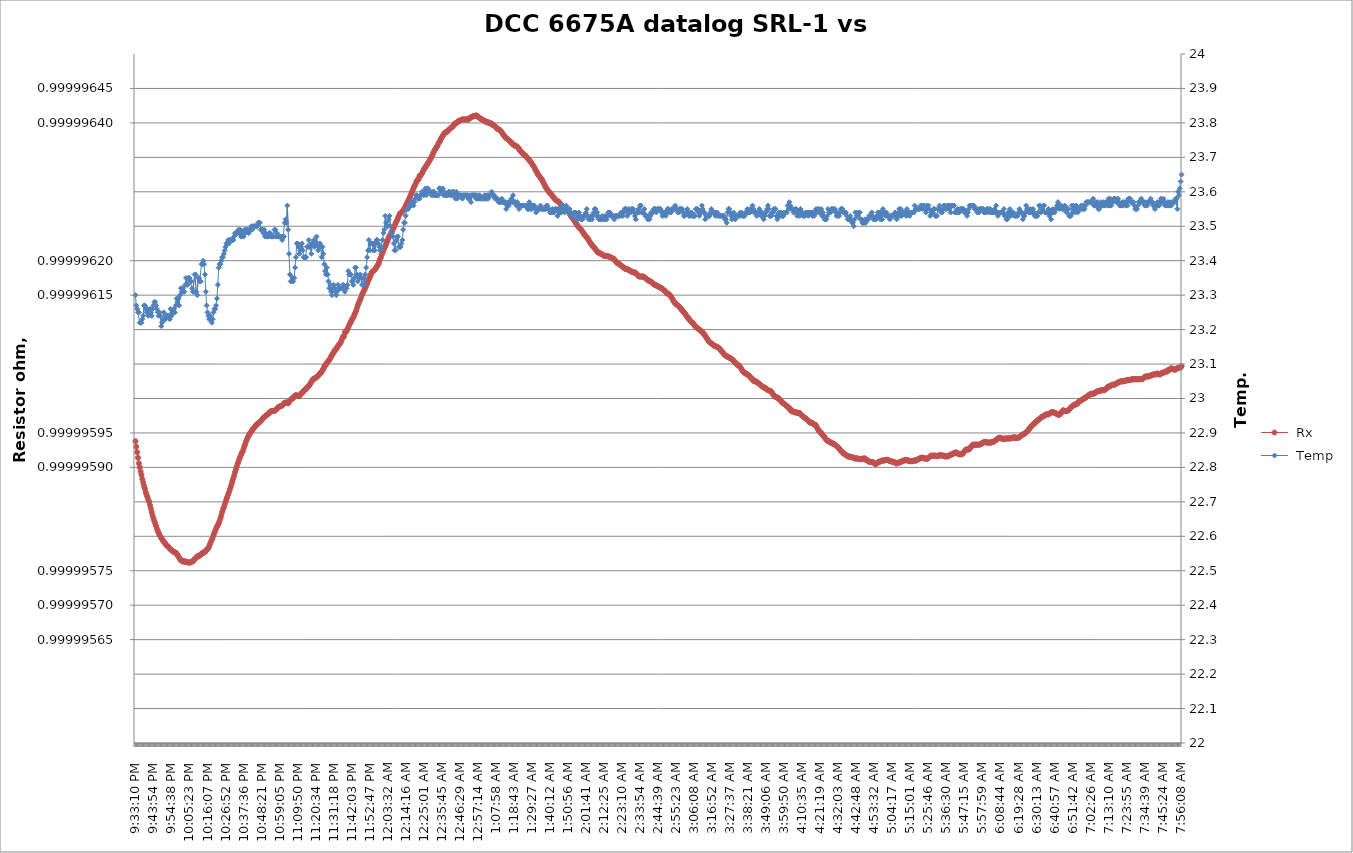
| Category |  Rx |
|---|---|
| 2021-03-11 21:33:10 | 1 |
| 2021-03-11 21:33:40 | 1 |
| 2021-03-11 21:34:11 | 1 |
| 2021-03-11 21:34:42 | 1 |
| 2021-03-11 21:35:12 | 1 |
| 2021-03-11 21:35:43 | 1 |
| 2021-03-11 21:36:14 | 1 |
| 2021-03-11 21:36:44 | 1 |
| 2021-03-11 21:37:15 | 1 |
| 2021-03-11 21:37:46 | 1 |
| 2021-03-11 21:38:16 | 1 |
| 2021-03-11 21:38:47 | 1 |
| 2021-03-11 21:39:18 | 1 |
| 2021-03-11 21:39:49 | 1 |
| 2021-03-11 21:40:19 | 1 |
| 2021-03-11 21:40:50 | 1 |
| 2021-03-11 21:41:21 | 1 |
| 2021-03-11 21:41:51 | 1 |
| 2021-03-11 21:42:22 | 1 |
| 2021-03-11 21:42:53 | 1 |
| 2021-03-11 21:43:23 | 1 |
| 2021-03-11 21:43:54 | 1 |
| 2021-03-11 21:44:25 | 1 |
| 2021-03-11 21:44:55 | 1 |
| 2021-03-11 21:45:26 | 1 |
| 2021-03-11 21:45:57 | 1 |
| 2021-03-11 21:46:27 | 1 |
| 2021-03-11 21:46:58 | 1 |
| 2021-03-11 21:47:29 | 1 |
| 2021-03-11 21:48:00 | 1 |
| 2021-03-11 21:48:30 | 1 |
| 2021-03-11 21:49:01 | 1 |
| 2021-03-11 21:49:32 | 1 |
| 2021-03-11 21:50:02 | 1 |
| 2021-03-11 21:50:33 | 1 |
| 2021-03-11 21:51:04 | 1 |
| 2021-03-11 21:51:34 | 1 |
| 2021-03-11 21:52:05 | 1 |
| 2021-03-11 21:52:36 | 1 |
| 2021-03-11 21:53:06 | 1 |
| 2021-03-11 21:53:37 | 1 |
| 2021-03-11 21:54:08 | 1 |
| 2021-03-11 21:54:38 | 1 |
| 2021-03-11 21:55:09 | 1 |
| 2021-03-11 21:55:40 | 1 |
| 2021-03-11 21:56:11 | 1 |
| 2021-03-11 21:56:41 | 1 |
| 2021-03-11 21:57:12 | 1 |
| 2021-03-11 21:57:43 | 1 |
| 2021-03-11 21:58:13 | 1 |
| 2021-03-11 21:58:44 | 1 |
| 2021-03-11 21:59:15 | 1 |
| 2021-03-11 21:59:45 | 1 |
| 2021-03-11 22:00:16 | 1 |
| 2021-03-11 22:00:47 | 1 |
| 2021-03-11 22:01:17 | 1 |
| 2021-03-11 22:01:48 | 1 |
| 2021-03-11 22:02:19 | 1 |
| 2021-03-11 22:02:49 | 1 |
| 2021-03-11 22:03:20 | 1 |
| 2021-03-11 22:03:51 | 1 |
| 2021-03-11 22:04:22 | 1 |
| 2021-03-11 22:04:52 | 1 |
| 2021-03-11 22:05:23 | 1 |
| 2021-03-11 22:05:54 | 1 |
| 2021-03-11 22:06:24 | 1 |
| 2021-03-11 22:06:55 | 1 |
| 2021-03-11 22:07:26 | 1 |
| 2021-03-11 22:07:56 | 1 |
| 2021-03-11 22:08:27 | 1 |
| 2021-03-11 22:08:58 | 1 |
| 2021-03-11 22:09:28 | 1 |
| 2021-03-11 22:09:59 | 1 |
| 2021-03-11 22:10:30 | 1 |
| 2021-03-11 22:11:00 | 1 |
| 2021-03-11 22:11:31 | 1 |
| 2021-03-11 22:12:02 | 1 |
| 2021-03-11 22:12:33 | 1 |
| 2021-03-11 22:13:03 | 1 |
| 2021-03-11 22:13:34 | 1 |
| 2021-03-11 22:14:05 | 1 |
| 2021-03-11 22:14:35 | 1 |
| 2021-03-11 22:15:06 | 1 |
| 2021-03-11 22:15:37 | 1 |
| 2021-03-11 22:16:07 | 1 |
| 2021-03-11 22:16:38 | 1 |
| 2021-03-11 22:17:09 | 1 |
| 2021-03-11 22:17:39 | 1 |
| 2021-03-11 22:18:10 | 1 |
| 2021-03-11 22:18:41 | 1 |
| 2021-03-11 22:19:11 | 1 |
| 2021-03-11 22:19:42 | 1 |
| 2021-03-11 22:20:13 | 1 |
| 2021-03-11 22:20:43 | 1 |
| 2021-03-11 22:21:14 | 1 |
| 2021-03-11 22:21:45 | 1 |
| 2021-03-11 22:22:16 | 1 |
| 2021-03-11 22:22:46 | 1 |
| 2021-03-11 22:23:17 | 1 |
| 2021-03-11 22:23:48 | 1 |
| 2021-03-11 22:24:18 | 1 |
| 2021-03-11 22:24:49 | 1 |
| 2021-03-11 22:25:20 | 1 |
| 2021-03-11 22:25:50 | 1 |
| 2021-03-11 22:26:21 | 1 |
| 2021-03-11 22:26:52 | 1 |
| 2021-03-11 22:27:22 | 1 |
| 2021-03-11 22:27:53 | 1 |
| 2021-03-11 22:28:24 | 1 |
| 2021-03-11 22:28:55 | 1 |
| 2021-03-11 22:29:25 | 1 |
| 2021-03-11 22:29:56 | 1 |
| 2021-03-11 22:30:27 | 1 |
| 2021-03-11 22:30:57 | 1 |
| 2021-03-11 22:31:28 | 1 |
| 2021-03-11 22:31:59 | 1 |
| 2021-03-11 22:32:29 | 1 |
| 2021-03-11 22:33:00 | 1 |
| 2021-03-11 22:33:31 | 1 |
| 2021-03-11 22:34:01 | 1 |
| 2021-03-11 22:34:32 | 1 |
| 2021-03-11 22:35:03 | 1 |
| 2021-03-11 22:35:33 | 1 |
| 2021-03-11 22:36:04 | 1 |
| 2021-03-11 22:36:35 | 1 |
| 2021-03-11 22:37:06 | 1 |
| 2021-03-11 22:37:36 | 1 |
| 2021-03-11 22:38:07 | 1 |
| 2021-03-11 22:38:38 | 1 |
| 2021-03-11 22:39:08 | 1 |
| 2021-03-11 22:39:39 | 1 |
| 2021-03-11 22:40:10 | 1 |
| 2021-03-11 22:40:40 | 1 |
| 2021-03-11 22:41:11 | 1 |
| 2021-03-11 22:41:42 | 1 |
| 2021-03-11 22:42:12 | 1 |
| 2021-03-11 22:42:43 | 1 |
| 2021-03-11 22:43:14 | 1 |
| 2021-03-11 22:43:45 | 1 |
| 2021-03-11 22:44:15 | 1 |
| 2021-03-11 22:44:46 | 1 |
| 2021-03-11 22:45:17 | 1 |
| 2021-03-11 22:45:47 | 1 |
| 2021-03-11 22:46:18 | 1 |
| 2021-03-11 22:46:49 | 1 |
| 2021-03-11 22:47:19 | 1 |
| 2021-03-11 22:47:50 | 1 |
| 2021-03-11 22:48:21 | 1 |
| 2021-03-11 22:48:51 | 1 |
| 2021-03-11 22:49:22 | 1 |
| 2021-03-11 22:49:53 | 1 |
| 2021-03-11 22:50:23 | 1 |
| 2021-03-11 22:50:54 | 1 |
| 2021-03-11 22:51:25 | 1 |
| 2021-03-11 22:51:56 | 1 |
| 2021-03-11 22:52:26 | 1 |
| 2021-03-11 22:52:57 | 1 |
| 2021-03-11 22:53:28 | 1 |
| 2021-03-11 22:53:58 | 1 |
| 2021-03-11 22:54:29 | 1 |
| 2021-03-11 22:55:00 | 1 |
| 2021-03-11 22:55:30 | 1 |
| 2021-03-11 22:56:01 | 1 |
| 2021-03-11 22:56:32 | 1 |
| 2021-03-11 22:57:02 | 1 |
| 2021-03-11 22:57:33 | 1 |
| 2021-03-11 22:58:04 | 1 |
| 2021-03-11 22:58:34 | 1 |
| 2021-03-11 22:59:05 | 1 |
| 2021-03-11 22:59:36 | 1 |
| 2021-03-11 23:00:07 | 1 |
| 2021-03-11 23:00:37 | 1 |
| 2021-03-11 23:01:08 | 1 |
| 2021-03-11 23:01:39 | 1 |
| 2021-03-11 23:02:09 | 1 |
| 2021-03-11 23:02:40 | 1 |
| 2021-03-11 23:03:11 | 1 |
| 2021-03-11 23:03:41 | 1 |
| 2021-03-11 23:04:12 | 1 |
| 2021-03-11 23:04:43 | 1 |
| 2021-03-11 23:05:13 | 1 |
| 2021-03-11 23:05:44 | 1 |
| 2021-03-11 23:06:15 | 1 |
| 2021-03-11 23:06:45 | 1 |
| 2021-03-11 23:07:16 | 1 |
| 2021-03-11 23:07:47 | 1 |
| 2021-03-11 23:08:18 | 1 |
| 2021-03-11 23:08:48 | 1 |
| 2021-03-11 23:09:19 | 1 |
| 2021-03-11 23:09:50 | 1 |
| 2021-03-11 23:10:20 | 1 |
| 2021-03-11 23:10:51 | 1 |
| 2021-03-11 23:11:22 | 1 |
| 2021-03-11 23:11:52 | 1 |
| 2021-03-11 23:12:23 | 1 |
| 2021-03-11 23:12:54 | 1 |
| 2021-03-11 23:13:24 | 1 |
| 2021-03-11 23:13:55 | 1 |
| 2021-03-11 23:14:26 | 1 |
| 2021-03-11 23:14:56 | 1 |
| 2021-03-11 23:15:27 | 1 |
| 2021-03-11 23:15:58 | 1 |
| 2021-03-11 23:16:29 | 1 |
| 2021-03-11 23:16:59 | 1 |
| 2021-03-11 23:17:30 | 1 |
| 2021-03-11 23:18:01 | 1 |
| 2021-03-11 23:18:31 | 1 |
| 2021-03-11 23:19:02 | 1 |
| 2021-03-11 23:19:33 | 1 |
| 2021-03-11 23:20:03 | 1 |
| 2021-03-11 23:20:34 | 1 |
| 2021-03-11 23:21:05 | 1 |
| 2021-03-11 23:21:35 | 1 |
| 2021-03-11 23:22:06 | 1 |
| 2021-03-11 23:22:37 | 1 |
| 2021-03-11 23:23:07 | 1 |
| 2021-03-11 23:23:38 | 1 |
| 2021-03-11 23:24:09 | 1 |
| 2021-03-11 23:24:40 | 1 |
| 2021-03-11 23:25:10 | 1 |
| 2021-03-11 23:25:41 | 1 |
| 2021-03-11 23:26:12 | 1 |
| 2021-03-11 23:26:42 | 1 |
| 2021-03-11 23:27:13 | 1 |
| 2021-03-11 23:27:44 | 1 |
| 2021-03-11 23:28:14 | 1 |
| 2021-03-11 23:28:45 | 1 |
| 2021-03-11 23:29:16 | 1 |
| 2021-03-11 23:29:46 | 1 |
| 2021-03-11 23:30:17 | 1 |
| 2021-03-11 23:30:48 | 1 |
| 2021-03-11 23:31:18 | 1 |
| 2021-03-11 23:31:49 | 1 |
| 2021-03-11 23:32:20 | 1 |
| 2021-03-11 23:32:51 | 1 |
| 2021-03-11 23:33:21 | 1 |
| 2021-03-11 23:33:52 | 1 |
| 2021-03-11 23:34:23 | 1 |
| 2021-03-11 23:34:53 | 1 |
| 2021-03-11 23:35:24 | 1 |
| 2021-03-11 23:35:55 | 1 |
| 2021-03-11 23:36:25 | 1 |
| 2021-03-11 23:36:56 | 1 |
| 2021-03-11 23:37:27 | 1 |
| 2021-03-11 23:37:57 | 1 |
| 2021-03-11 23:38:28 | 1 |
| 2021-03-11 23:38:59 | 1 |
| 2021-03-11 23:39:29 | 1 |
| 2021-03-11 23:40:00 | 1 |
| 2021-03-11 23:40:31 | 1 |
| 2021-03-11 23:41:01 | 1 |
| 2021-03-11 23:41:32 | 1 |
| 2021-03-11 23:42:03 | 1 |
| 2021-03-11 23:42:34 | 1 |
| 2021-03-11 23:43:04 | 1 |
| 2021-03-11 23:43:35 | 1 |
| 2021-03-11 23:44:06 | 1 |
| 2021-03-11 23:44:36 | 1 |
| 2021-03-11 23:45:07 | 1 |
| 2021-03-11 23:45:38 | 1 |
| 2021-03-11 23:46:08 | 1 |
| 2021-03-11 23:46:39 | 1 |
| 2021-03-11 23:47:10 | 1 |
| 2021-03-11 23:47:40 | 1 |
| 2021-03-11 23:48:11 | 1 |
| 2021-03-11 23:48:42 | 1 |
| 2021-03-11 23:49:12 | 1 |
| 2021-03-11 23:49:43 | 1 |
| 2021-03-11 23:50:14 | 1 |
| 2021-03-11 23:50:45 | 1 |
| 2021-03-11 23:51:15 | 1 |
| 2021-03-11 23:51:46 | 1 |
| 2021-03-11 23:52:17 | 1 |
| 2021-03-11 23:52:47 | 1 |
| 2021-03-11 23:53:18 | 1 |
| 2021-03-11 23:53:49 | 1 |
| 2021-03-11 23:54:19 | 1 |
| 2021-03-11 23:54:50 | 1 |
| 2021-03-11 23:55:21 | 1 |
| 2021-03-11 23:55:51 | 1 |
| 2021-03-11 23:56:22 | 1 |
| 2021-03-11 23:56:53 | 1 |
| 2021-03-11 23:57:23 | 1 |
| 2021-03-11 23:57:54 | 1 |
| 2021-03-11 23:58:25 | 1 |
| 2021-03-11 23:58:55 | 1 |
| 2021-03-11 23:59:26 | 1 |
| 2021-03-11 23:59:57 | 1 |
| 2021-03-12 00:00:28 | 1 |
| 2021-03-12 00:00:58 | 1 |
| 2021-03-12 00:01:29 | 1 |
| 2021-03-12 00:02:00 | 1 |
| 2021-03-12 00:02:30 | 1 |
| 2021-03-12 00:03:01 | 1 |
| 2021-03-12 00:03:32 | 1 |
| 2021-03-12 00:04:02 | 1 |
| 2021-03-12 00:04:33 | 1 |
| 2021-03-12 00:05:04 | 1 |
| 2021-03-12 00:05:34 | 1 |
| 2021-03-12 00:06:05 | 1 |
| 2021-03-12 00:06:36 | 1 |
| 2021-03-12 00:07:06 | 1 |
| 2021-03-12 00:07:37 | 1 |
| 2021-03-12 00:08:08 | 1 |
| 2021-03-12 00:08:39 | 1 |
| 2021-03-12 00:09:09 | 1 |
| 2021-03-12 00:09:40 | 1 |
| 2021-03-12 00:10:11 | 1 |
| 2021-03-12 00:10:41 | 1 |
| 2021-03-12 00:11:12 | 1 |
| 2021-03-12 00:11:43 | 1 |
| 2021-03-12 00:12:13 | 1 |
| 2021-03-12 00:12:44 | 1 |
| 2021-03-12 00:13:15 | 1 |
| 2021-03-12 00:13:45 | 1 |
| 2021-03-12 00:14:16 | 1 |
| 2021-03-12 00:14:47 | 1 |
| 2021-03-12 00:15:17 | 1 |
| 2021-03-12 00:15:48 | 1 |
| 2021-03-12 00:16:19 | 1 |
| 2021-03-12 00:16:50 | 1 |
| 2021-03-12 00:17:20 | 1 |
| 2021-03-12 00:17:51 | 1 |
| 2021-03-12 00:18:22 | 1 |
| 2021-03-12 00:18:52 | 1 |
| 2021-03-12 00:19:23 | 1 |
| 2021-03-12 00:19:54 | 1 |
| 2021-03-12 00:20:24 | 1 |
| 2021-03-12 00:20:55 | 1 |
| 2021-03-12 00:21:26 | 1 |
| 2021-03-12 00:21:56 | 1 |
| 2021-03-12 00:22:27 | 1 |
| 2021-03-12 00:22:58 | 1 |
| 2021-03-12 00:23:28 | 1 |
| 2021-03-12 00:23:59 | 1 |
| 2021-03-12 00:24:30 | 1 |
| 2021-03-12 00:25:01 | 1 |
| 2021-03-12 00:25:31 | 1 |
| 2021-03-12 00:26:02 | 1 |
| 2021-03-12 00:26:33 | 1 |
| 2021-03-12 00:27:03 | 1 |
| 2021-03-12 00:27:34 | 1 |
| 2021-03-12 00:28:05 | 1 |
| 2021-03-12 00:28:35 | 1 |
| 2021-03-12 00:29:06 | 1 |
| 2021-03-12 00:29:37 | 1 |
| 2021-03-12 00:30:07 | 1 |
| 2021-03-12 00:30:38 | 1 |
| 2021-03-12 00:31:09 | 1 |
| 2021-03-12 00:31:39 | 1 |
| 2021-03-12 00:32:10 | 1 |
| 2021-03-12 00:32:41 | 1 |
| 2021-03-12 00:33:12 | 1 |
| 2021-03-12 00:33:42 | 1 |
| 2021-03-12 00:34:13 | 1 |
| 2021-03-12 00:34:44 | 1 |
| 2021-03-12 00:35:14 | 1 |
| 2021-03-12 00:35:45 | 1 |
| 2021-03-12 00:36:16 | 1 |
| 2021-03-12 00:36:46 | 1 |
| 2021-03-12 00:37:17 | 1 |
| 2021-03-12 00:37:48 | 1 |
| 2021-03-12 00:38:18 | 1 |
| 2021-03-12 00:38:49 | 1 |
| 2021-03-12 00:39:20 | 1 |
| 2021-03-12 00:39:50 | 1 |
| 2021-03-12 00:40:21 | 1 |
| 2021-03-12 00:40:52 | 1 |
| 2021-03-12 00:41:23 | 1 |
| 2021-03-12 00:41:53 | 1 |
| 2021-03-12 00:42:24 | 1 |
| 2021-03-12 00:42:55 | 1 |
| 2021-03-12 00:43:25 | 1 |
| 2021-03-12 00:43:56 | 1 |
| 2021-03-12 00:44:27 | 1 |
| 2021-03-12 00:44:57 | 1 |
| 2021-03-12 00:45:28 | 1 |
| 2021-03-12 00:45:59 | 1 |
| 2021-03-12 00:46:29 | 1 |
| 2021-03-12 00:47:00 | 1 |
| 2021-03-12 00:47:31 | 1 |
| 2021-03-12 00:48:02 | 1 |
| 2021-03-12 00:48:32 | 1 |
| 2021-03-12 00:49:03 | 1 |
| 2021-03-12 00:49:34 | 1 |
| 2021-03-12 00:50:04 | 1 |
| 2021-03-12 00:50:35 | 1 |
| 2021-03-12 00:51:06 | 1 |
| 2021-03-12 00:51:36 | 1 |
| 2021-03-12 00:52:07 | 1 |
| 2021-03-12 00:52:38 | 1 |
| 2021-03-12 00:53:08 | 1 |
| 2021-03-12 00:53:39 | 1 |
| 2021-03-12 00:54:10 | 1 |
| 2021-03-12 00:54:40 | 1 |
| 2021-03-12 00:55:11 | 1 |
| 2021-03-12 00:55:42 | 1 |
| 2021-03-12 00:56:13 | 1 |
| 2021-03-12 00:56:43 | 1 |
| 2021-03-12 00:57:14 | 1 |
| 2021-03-12 00:57:45 | 1 |
| 2021-03-12 00:58:15 | 1 |
| 2021-03-12 00:58:46 | 1 |
| 2021-03-12 00:59:17 | 1 |
| 2021-03-12 00:59:47 | 1 |
| 2021-03-12 01:00:18 | 1 |
| 2021-03-12 01:00:49 | 1 |
| 2021-03-12 01:01:19 | 1 |
| 2021-03-12 01:01:50 | 1 |
| 2021-03-12 01:02:21 | 1 |
| 2021-03-12 01:02:52 | 1 |
| 2021-03-12 01:03:22 | 1 |
| 2021-03-12 01:03:53 | 1 |
| 2021-03-12 01:04:24 | 1 |
| 2021-03-12 01:04:54 | 1 |
| 2021-03-12 01:05:25 | 1 |
| 2021-03-12 01:05:56 | 1 |
| 2021-03-12 01:06:26 | 1 |
| 2021-03-12 01:06:57 | 1 |
| 2021-03-12 01:07:28 | 1 |
| 2021-03-12 01:07:58 | 1 |
| 2021-03-12 01:08:29 | 1 |
| 2021-03-12 01:09:00 | 1 |
| 2021-03-12 01:09:30 | 1 |
| 2021-03-12 01:10:01 | 1 |
| 2021-03-12 01:10:32 | 1 |
| 2021-03-12 01:11:03 | 1 |
| 2021-03-12 01:11:33 | 1 |
| 2021-03-12 01:12:04 | 1 |
| 2021-03-12 01:12:35 | 1 |
| 2021-03-12 01:13:05 | 1 |
| 2021-03-12 01:13:36 | 1 |
| 2021-03-12 01:14:07 | 1 |
| 2021-03-12 01:14:37 | 1 |
| 2021-03-12 01:15:08 | 1 |
| 2021-03-12 01:15:39 | 1 |
| 2021-03-12 01:16:09 | 1 |
| 2021-03-12 01:16:40 | 1 |
| 2021-03-12 01:17:11 | 1 |
| 2021-03-12 01:17:41 | 1 |
| 2021-03-12 01:18:12 | 1 |
| 2021-03-12 01:18:43 | 1 |
| 2021-03-12 01:19:14 | 1 |
| 2021-03-12 01:19:44 | 1 |
| 2021-03-12 01:20:15 | 1 |
| 2021-03-12 01:20:46 | 1 |
| 2021-03-12 01:21:16 | 1 |
| 2021-03-12 01:21:47 | 1 |
| 2021-03-12 01:22:18 | 1 |
| 2021-03-12 01:22:48 | 1 |
| 2021-03-12 01:23:19 | 1 |
| 2021-03-12 01:23:50 | 1 |
| 2021-03-12 01:24:20 | 1 |
| 2021-03-12 01:24:51 | 1 |
| 2021-03-12 01:25:22 | 1 |
| 2021-03-12 01:25:52 | 1 |
| 2021-03-12 01:26:23 | 1 |
| 2021-03-12 01:26:54 | 1 |
| 2021-03-12 01:27:25 | 1 |
| 2021-03-12 01:27:55 | 1 |
| 2021-03-12 01:28:26 | 1 |
| 2021-03-12 01:28:57 | 1 |
| 2021-03-12 01:29:27 | 1 |
| 2021-03-12 01:29:58 | 1 |
| 2021-03-12 01:30:29 | 1 |
| 2021-03-12 01:30:59 | 1 |
| 2021-03-12 01:31:30 | 1 |
| 2021-03-12 01:32:01 | 1 |
| 2021-03-12 01:32:31 | 1 |
| 2021-03-12 01:33:02 | 1 |
| 2021-03-12 01:33:33 | 1 |
| 2021-03-12 01:34:04 | 1 |
| 2021-03-12 01:34:34 | 1 |
| 2021-03-12 01:35:05 | 1 |
| 2021-03-12 01:35:36 | 1 |
| 2021-03-12 01:36:06 | 1 |
| 2021-03-12 01:36:37 | 1 |
| 2021-03-12 01:37:08 | 1 |
| 2021-03-12 01:37:38 | 1 |
| 2021-03-12 01:38:09 | 1 |
| 2021-03-12 01:38:40 | 1 |
| 2021-03-12 01:39:10 | 1 |
| 2021-03-12 01:39:41 | 1 |
| 2021-03-12 01:40:12 | 1 |
| 2021-03-12 01:40:42 | 1 |
| 2021-03-12 01:41:13 | 1 |
| 2021-03-12 01:41:44 | 1 |
| 2021-03-12 01:42:15 | 1 |
| 2021-03-12 01:42:45 | 1 |
| 2021-03-12 01:43:16 | 1 |
| 2021-03-12 01:43:47 | 1 |
| 2021-03-12 01:44:17 | 1 |
| 2021-03-12 01:44:48 | 1 |
| 2021-03-12 01:45:19 | 1 |
| 2021-03-12 01:45:49 | 1 |
| 2021-03-12 01:46:20 | 1 |
| 2021-03-12 01:46:51 | 1 |
| 2021-03-12 01:47:21 | 1 |
| 2021-03-12 01:47:52 | 1 |
| 2021-03-12 01:48:23 | 1 |
| 2021-03-12 01:48:54 | 1 |
| 2021-03-12 01:49:24 | 1 |
| 2021-03-12 01:49:55 | 1 |
| 2021-03-12 01:50:26 | 1 |
| 2021-03-12 01:50:56 | 1 |
| 2021-03-12 01:51:27 | 1 |
| 2021-03-12 01:51:58 | 1 |
| 2021-03-12 01:52:28 | 1 |
| 2021-03-12 01:52:59 | 1 |
| 2021-03-12 01:53:30 | 1 |
| 2021-03-12 01:54:00 | 1 |
| 2021-03-12 01:54:31 | 1 |
| 2021-03-12 01:55:02 | 1 |
| 2021-03-12 01:55:32 | 1 |
| 2021-03-12 01:56:03 | 1 |
| 2021-03-12 01:56:34 | 1 |
| 2021-03-12 01:57:05 | 1 |
| 2021-03-12 01:57:35 | 1 |
| 2021-03-12 01:58:06 | 1 |
| 2021-03-12 01:58:37 | 1 |
| 2021-03-12 01:59:07 | 1 |
| 2021-03-12 01:59:38 | 1 |
| 2021-03-12 02:00:09 | 1 |
| 2021-03-12 02:00:39 | 1 |
| 2021-03-12 02:01:10 | 1 |
| 2021-03-12 02:01:41 | 1 |
| 2021-03-12 02:02:11 | 1 |
| 2021-03-12 02:02:42 | 1 |
| 2021-03-12 02:03:13 | 1 |
| 2021-03-12 02:03:43 | 1 |
| 2021-03-12 02:04:14 | 1 |
| 2021-03-12 02:04:45 | 1 |
| 2021-03-12 02:05:16 | 1 |
| 2021-03-12 02:05:46 | 1 |
| 2021-03-12 02:06:17 | 1 |
| 2021-03-12 02:06:48 | 1 |
| 2021-03-12 02:07:18 | 1 |
| 2021-03-12 02:07:49 | 1 |
| 2021-03-12 02:08:20 | 1 |
| 2021-03-12 02:08:50 | 1 |
| 2021-03-12 02:09:21 | 1 |
| 2021-03-12 02:09:52 | 1 |
| 2021-03-12 02:10:22 | 1 |
| 2021-03-12 02:10:53 | 1 |
| 2021-03-12 02:11:24 | 1 |
| 2021-03-12 02:11:54 | 1 |
| 2021-03-12 02:12:25 | 1 |
| 2021-03-12 02:12:56 | 1 |
| 2021-03-12 02:13:27 | 1 |
| 2021-03-12 02:13:57 | 1 |
| 2021-03-12 02:14:28 | 1 |
| 2021-03-12 02:14:59 | 1 |
| 2021-03-12 02:15:29 | 1 |
| 2021-03-12 02:16:00 | 1 |
| 2021-03-12 02:16:31 | 1 |
| 2021-03-12 02:17:01 | 1 |
| 2021-03-12 02:17:32 | 1 |
| 2021-03-12 02:18:03 | 1 |
| 2021-03-12 02:18:33 | 1 |
| 2021-03-12 02:19:04 | 1 |
| 2021-03-12 02:19:35 | 1 |
| 2021-03-12 02:20:06 | 1 |
| 2021-03-12 02:20:36 | 1 |
| 2021-03-12 02:21:07 | 1 |
| 2021-03-12 02:21:38 | 1 |
| 2021-03-12 02:22:08 | 1 |
| 2021-03-12 02:22:39 | 1 |
| 2021-03-12 02:23:10 | 1 |
| 2021-03-12 02:23:40 | 1 |
| 2021-03-12 02:24:11 | 1 |
| 2021-03-12 02:24:42 | 1 |
| 2021-03-12 02:25:12 | 1 |
| 2021-03-12 02:25:43 | 1 |
| 2021-03-12 02:26:14 | 1 |
| 2021-03-12 02:26:44 | 1 |
| 2021-03-12 02:27:15 | 1 |
| 2021-03-12 02:27:46 | 1 |
| 2021-03-12 02:28:17 | 1 |
| 2021-03-12 02:28:47 | 1 |
| 2021-03-12 02:29:18 | 1 |
| 2021-03-12 02:29:49 | 1 |
| 2021-03-12 02:30:19 | 1 |
| 2021-03-12 02:30:50 | 1 |
| 2021-03-12 02:31:21 | 1 |
| 2021-03-12 02:31:51 | 1 |
| 2021-03-12 02:32:22 | 1 |
| 2021-03-12 02:32:53 | 1 |
| 2021-03-12 02:33:23 | 1 |
| 2021-03-12 02:33:54 | 1 |
| 2021-03-12 02:34:25 | 1 |
| 2021-03-12 02:34:56 | 1 |
| 2021-03-12 02:35:26 | 1 |
| 2021-03-12 02:35:57 | 1 |
| 2021-03-12 02:36:28 | 1 |
| 2021-03-12 02:36:58 | 1 |
| 2021-03-12 02:37:29 | 1 |
| 2021-03-12 02:38:00 | 1 |
| 2021-03-12 02:38:30 | 1 |
| 2021-03-12 02:39:01 | 1 |
| 2021-03-12 02:39:32 | 1 |
| 2021-03-12 02:40:02 | 1 |
| 2021-03-12 02:40:33 | 1 |
| 2021-03-12 02:41:04 | 1 |
| 2021-03-12 02:41:35 | 1 |
| 2021-03-12 02:42:05 | 1 |
| 2021-03-12 02:42:36 | 1 |
| 2021-03-12 02:43:07 | 1 |
| 2021-03-12 02:43:37 | 1 |
| 2021-03-12 02:44:08 | 1 |
| 2021-03-12 02:44:39 | 1 |
| 2021-03-12 02:45:09 | 1 |
| 2021-03-12 02:45:40 | 1 |
| 2021-03-12 02:46:11 | 1 |
| 2021-03-12 02:46:41 | 1 |
| 2021-03-12 02:47:12 | 1 |
| 2021-03-12 02:47:43 | 1 |
| 2021-03-12 02:48:14 | 1 |
| 2021-03-12 02:48:44 | 1 |
| 2021-03-12 02:49:15 | 1 |
| 2021-03-12 02:49:46 | 1 |
| 2021-03-12 02:50:16 | 1 |
| 2021-03-12 02:50:47 | 1 |
| 2021-03-12 02:51:18 | 1 |
| 2021-03-12 02:51:48 | 1 |
| 2021-03-12 02:52:19 | 1 |
| 2021-03-12 02:52:50 | 1 |
| 2021-03-12 02:53:20 | 1 |
| 2021-03-12 02:53:51 | 1 |
| 2021-03-12 02:54:22 | 1 |
| 2021-03-12 02:54:53 | 1 |
| 2021-03-12 02:55:23 | 1 |
| 2021-03-12 02:55:54 | 1 |
| 2021-03-12 02:56:25 | 1 |
| 2021-03-12 02:56:55 | 1 |
| 2021-03-12 02:57:26 | 1 |
| 2021-03-12 02:57:57 | 1 |
| 2021-03-12 02:58:27 | 1 |
| 2021-03-12 02:58:58 | 1 |
| 2021-03-12 02:59:29 | 1 |
| 2021-03-12 02:59:59 | 1 |
| 2021-03-12 03:00:30 | 1 |
| 2021-03-12 03:01:01 | 1 |
| 2021-03-12 03:01:31 | 1 |
| 2021-03-12 03:02:02 | 1 |
| 2021-03-12 03:02:33 | 1 |
| 2021-03-12 03:03:04 | 1 |
| 2021-03-12 03:03:34 | 1 |
| 2021-03-12 03:04:05 | 1 |
| 2021-03-12 03:04:36 | 1 |
| 2021-03-12 03:05:06 | 1 |
| 2021-03-12 03:05:37 | 1 |
| 2021-03-12 03:06:08 | 1 |
| 2021-03-12 03:06:38 | 1 |
| 2021-03-12 03:07:09 | 1 |
| 2021-03-12 03:07:40 | 1 |
| 2021-03-12 03:08:10 | 1 |
| 2021-03-12 03:08:41 | 1 |
| 2021-03-12 03:09:12 | 1 |
| 2021-03-12 03:09:43 | 1 |
| 2021-03-12 03:10:13 | 1 |
| 2021-03-12 03:10:44 | 1 |
| 2021-03-12 03:11:15 | 1 |
| 2021-03-12 03:11:45 | 1 |
| 2021-03-12 03:12:16 | 1 |
| 2021-03-12 03:12:47 | 1 |
| 2021-03-12 03:13:17 | 1 |
| 2021-03-12 03:13:48 | 1 |
| 2021-03-12 03:14:19 | 1 |
| 2021-03-12 03:14:49 | 1 |
| 2021-03-12 03:15:20 | 1 |
| 2021-03-12 03:15:51 | 1 |
| 2021-03-12 03:16:22 | 1 |
| 2021-03-12 03:16:52 | 1 |
| 2021-03-12 03:17:23 | 1 |
| 2021-03-12 03:17:54 | 1 |
| 2021-03-12 03:18:24 | 1 |
| 2021-03-12 03:18:55 | 1 |
| 2021-03-12 03:19:26 | 1 |
| 2021-03-12 03:19:56 | 1 |
| 2021-03-12 03:20:27 | 1 |
| 2021-03-12 03:20:58 | 1 |
| 2021-03-12 03:21:28 | 1 |
| 2021-03-12 03:21:59 | 1 |
| 2021-03-12 03:22:30 | 1 |
| 2021-03-12 03:23:00 | 1 |
| 2021-03-12 03:23:31 | 1 |
| 2021-03-12 03:24:02 | 1 |
| 2021-03-12 03:24:33 | 1 |
| 2021-03-12 03:25:03 | 1 |
| 2021-03-12 03:25:34 | 1 |
| 2021-03-12 03:26:05 | 1 |
| 2021-03-12 03:26:35 | 1 |
| 2021-03-12 03:27:06 | 1 |
| 2021-03-12 03:27:37 | 1 |
| 2021-03-12 03:28:07 | 1 |
| 2021-03-12 03:28:38 | 1 |
| 2021-03-12 03:29:09 | 1 |
| 2021-03-12 03:29:39 | 1 |
| 2021-03-12 03:30:10 | 1 |
| 2021-03-12 03:30:41 | 1 |
| 2021-03-12 03:31:12 | 1 |
| 2021-03-12 03:31:42 | 1 |
| 2021-03-12 03:32:13 | 1 |
| 2021-03-12 03:32:44 | 1 |
| 2021-03-12 03:33:14 | 1 |
| 2021-03-12 03:33:45 | 1 |
| 2021-03-12 03:34:16 | 1 |
| 2021-03-12 03:34:46 | 1 |
| 2021-03-12 03:35:17 | 1 |
| 2021-03-12 03:35:48 | 1 |
| 2021-03-12 03:36:18 | 1 |
| 2021-03-12 03:36:49 | 1 |
| 2021-03-12 03:37:20 | 1 |
| 2021-03-12 03:37:50 | 1 |
| 2021-03-12 03:38:21 | 1 |
| 2021-03-12 03:38:52 | 1 |
| 2021-03-12 03:39:23 | 1 |
| 2021-03-12 03:39:53 | 1 |
| 2021-03-12 03:40:24 | 1 |
| 2021-03-12 03:40:55 | 1 |
| 2021-03-12 03:41:25 | 1 |
| 2021-03-12 03:41:56 | 1 |
| 2021-03-12 03:42:27 | 1 |
| 2021-03-12 03:42:57 | 1 |
| 2021-03-12 03:43:28 | 1 |
| 2021-03-12 03:43:59 | 1 |
| 2021-03-12 03:44:29 | 1 |
| 2021-03-12 03:45:00 | 1 |
| 2021-03-12 03:45:31 | 1 |
| 2021-03-12 03:46:01 | 1 |
| 2021-03-12 03:46:32 | 1 |
| 2021-03-12 03:47:03 | 1 |
| 2021-03-12 03:47:34 | 1 |
| 2021-03-12 03:48:04 | 1 |
| 2021-03-12 03:48:35 | 1 |
| 2021-03-12 03:49:06 | 1 |
| 2021-03-12 03:49:36 | 1 |
| 2021-03-12 03:50:07 | 1 |
| 2021-03-12 03:50:38 | 1 |
| 2021-03-12 03:51:08 | 1 |
| 2021-03-12 03:51:39 | 1 |
| 2021-03-12 03:52:10 | 1 |
| 2021-03-12 03:52:40 | 1 |
| 2021-03-12 03:53:11 | 1 |
| 2021-03-12 03:53:42 | 1 |
| 2021-03-12 03:54:13 | 1 |
| 2021-03-12 03:54:43 | 1 |
| 2021-03-12 03:55:14 | 1 |
| 2021-03-12 03:55:45 | 1 |
| 2021-03-12 03:56:15 | 1 |
| 2021-03-12 03:56:46 | 1 |
| 2021-03-12 03:57:17 | 1 |
| 2021-03-12 03:57:47 | 1 |
| 2021-03-12 03:58:18 | 1 |
| 2021-03-12 03:58:49 | 1 |
| 2021-03-12 03:59:19 | 1 |
| 2021-03-12 03:59:50 | 1 |
| 2021-03-12 04:00:21 | 1 |
| 2021-03-12 04:00:51 | 1 |
| 2021-03-12 04:01:22 | 1 |
| 2021-03-12 04:01:53 | 1 |
| 2021-03-12 04:02:24 | 1 |
| 2021-03-12 04:02:54 | 1 |
| 2021-03-12 04:03:25 | 1 |
| 2021-03-12 04:03:56 | 1 |
| 2021-03-12 04:04:26 | 1 |
| 2021-03-12 04:04:57 | 1 |
| 2021-03-12 04:05:28 | 1 |
| 2021-03-12 04:05:58 | 1 |
| 2021-03-12 04:06:29 | 1 |
| 2021-03-12 04:07:00 | 1 |
| 2021-03-12 04:07:30 | 1 |
| 2021-03-12 04:08:01 | 1 |
| 2021-03-12 04:08:32 | 1 |
| 2021-03-12 04:09:02 | 1 |
| 2021-03-12 04:09:33 | 1 |
| 2021-03-12 04:10:04 | 1 |
| 2021-03-12 04:10:35 | 1 |
| 2021-03-12 04:11:05 | 1 |
| 2021-03-12 04:11:36 | 1 |
| 2021-03-12 04:12:07 | 1 |
| 2021-03-12 04:12:37 | 1 |
| 2021-03-12 04:13:08 | 1 |
| 2021-03-12 04:13:39 | 1 |
| 2021-03-12 04:14:09 | 1 |
| 2021-03-12 04:14:40 | 1 |
| 2021-03-12 04:15:11 | 1 |
| 2021-03-12 04:15:41 | 1 |
| 2021-03-12 04:16:12 | 1 |
| 2021-03-12 04:16:43 | 1 |
| 2021-03-12 04:17:13 | 1 |
| 2021-03-12 04:17:44 | 1 |
| 2021-03-12 04:18:15 | 1 |
| 2021-03-12 04:18:46 | 1 |
| 2021-03-12 04:19:16 | 1 |
| 2021-03-12 04:19:47 | 1 |
| 2021-03-12 04:20:18 | 1 |
| 2021-03-12 04:20:48 | 1 |
| 2021-03-12 04:21:19 | 1 |
| 2021-03-12 04:21:50 | 1 |
| 2021-03-12 04:22:20 | 1 |
| 2021-03-12 04:22:51 | 1 |
| 2021-03-12 04:23:22 | 1 |
| 2021-03-12 04:23:52 | 1 |
| 2021-03-12 04:24:23 | 1 |
| 2021-03-12 04:24:54 | 1 |
| 2021-03-12 04:25:25 | 1 |
| 2021-03-12 04:25:55 | 1 |
| 2021-03-12 04:26:26 | 1 |
| 2021-03-12 04:26:57 | 1 |
| 2021-03-12 04:27:27 | 1 |
| 2021-03-12 04:27:58 | 1 |
| 2021-03-12 04:28:29 | 1 |
| 2021-03-12 04:28:59 | 1 |
| 2021-03-12 04:29:30 | 1 |
| 2021-03-12 04:30:01 | 1 |
| 2021-03-12 04:30:31 | 1 |
| 2021-03-12 04:31:02 | 1 |
| 2021-03-12 04:31:33 | 1 |
| 2021-03-12 04:32:03 | 1 |
| 2021-03-12 04:32:34 | 1 |
| 2021-03-12 04:33:05 | 1 |
| 2021-03-12 04:33:36 | 1 |
| 2021-03-12 04:34:06 | 1 |
| 2021-03-12 04:34:37 | 1 |
| 2021-03-12 04:35:08 | 1 |
| 2021-03-12 04:35:38 | 1 |
| 2021-03-12 04:36:09 | 1 |
| 2021-03-12 04:36:40 | 1 |
| 2021-03-12 04:37:10 | 1 |
| 2021-03-12 04:37:41 | 1 |
| 2021-03-12 04:38:12 | 1 |
| 2021-03-12 04:38:42 | 1 |
| 2021-03-12 04:39:13 | 1 |
| 2021-03-12 04:39:44 | 1 |
| 2021-03-12 04:40:15 | 1 |
| 2021-03-12 04:40:45 | 1 |
| 2021-03-12 04:41:16 | 1 |
| 2021-03-12 04:41:47 | 1 |
| 2021-03-12 04:42:17 | 1 |
| 2021-03-12 04:42:48 | 1 |
| 2021-03-12 04:43:19 | 1 |
| 2021-03-12 04:43:49 | 1 |
| 2021-03-12 04:44:20 | 1 |
| 2021-03-12 04:44:51 | 1 |
| 2021-03-12 04:45:21 | 1 |
| 2021-03-12 04:45:52 | 1 |
| 2021-03-12 04:46:23 | 1 |
| 2021-03-12 04:46:53 | 1 |
| 2021-03-12 04:47:24 | 1 |
| 2021-03-12 04:47:55 | 1 |
| 2021-03-12 04:48:26 | 1 |
| 2021-03-12 04:48:56 | 1 |
| 2021-03-12 04:49:27 | 1 |
| 2021-03-12 04:49:58 | 1 |
| 2021-03-12 04:50:28 | 1 |
| 2021-03-12 04:50:59 | 1 |
| 2021-03-12 04:51:30 | 1 |
| 2021-03-12 04:52:00 | 1 |
| 2021-03-12 04:52:31 | 1 |
| 2021-03-12 04:53:02 | 1 |
| 2021-03-12 04:53:32 | 1 |
| 2021-03-12 04:54:03 | 1 |
| 2021-03-12 04:54:34 | 1 |
| 2021-03-12 04:55:04 | 1 |
| 2021-03-12 04:55:35 | 1 |
| 2021-03-12 04:56:06 | 1 |
| 2021-03-12 04:56:37 | 1 |
| 2021-03-12 04:57:07 | 1 |
| 2021-03-12 04:57:38 | 1 |
| 2021-03-12 04:58:09 | 1 |
| 2021-03-12 04:58:39 | 1 |
| 2021-03-12 04:59:10 | 1 |
| 2021-03-12 04:59:41 | 1 |
| 2021-03-12 05:00:11 | 1 |
| 2021-03-12 05:00:42 | 1 |
| 2021-03-12 05:01:13 | 1 |
| 2021-03-12 05:01:43 | 1 |
| 2021-03-12 05:02:14 | 1 |
| 2021-03-12 05:02:45 | 1 |
| 2021-03-12 05:03:15 | 1 |
| 2021-03-12 05:03:46 | 1 |
| 2021-03-12 05:04:17 | 1 |
| 2021-03-12 05:04:48 | 1 |
| 2021-03-12 05:05:18 | 1 |
| 2021-03-12 05:05:49 | 1 |
| 2021-03-12 05:06:20 | 1 |
| 2021-03-12 05:06:50 | 1 |
| 2021-03-12 05:07:21 | 1 |
| 2021-03-12 05:07:52 | 1 |
| 2021-03-12 05:08:22 | 1 |
| 2021-03-12 05:08:53 | 1 |
| 2021-03-12 05:09:24 | 1 |
| 2021-03-12 05:09:54 | 1 |
| 2021-03-12 05:10:25 | 1 |
| 2021-03-12 05:10:56 | 1 |
| 2021-03-12 05:11:27 | 1 |
| 2021-03-12 05:11:57 | 1 |
| 2021-03-12 05:12:28 | 1 |
| 2021-03-12 05:12:59 | 1 |
| 2021-03-12 05:13:29 | 1 |
| 2021-03-12 05:14:00 | 1 |
| 2021-03-12 05:14:31 | 1 |
| 2021-03-12 05:15:01 | 1 |
| 2021-03-12 05:15:32 | 1 |
| 2021-03-12 05:16:03 | 1 |
| 2021-03-12 05:16:33 | 1 |
| 2021-03-12 05:17:04 | 1 |
| 2021-03-12 05:17:35 | 1 |
| 2021-03-12 05:18:05 | 1 |
| 2021-03-12 05:18:36 | 1 |
| 2021-03-12 05:19:07 | 1 |
| 2021-03-12 05:19:38 | 1 |
| 2021-03-12 05:20:08 | 1 |
| 2021-03-12 05:20:39 | 1 |
| 2021-03-12 05:21:10 | 1 |
| 2021-03-12 05:21:40 | 1 |
| 2021-03-12 05:22:11 | 1 |
| 2021-03-12 05:22:42 | 1 |
| 2021-03-12 05:23:12 | 1 |
| 2021-03-12 05:23:43 | 1 |
| 2021-03-12 05:24:14 | 1 |
| 2021-03-12 05:24:44 | 1 |
| 2021-03-12 05:25:15 | 1 |
| 2021-03-12 05:25:46 | 1 |
| 2021-03-12 05:26:17 | 1 |
| 2021-03-12 05:26:47 | 1 |
| 2021-03-12 05:27:18 | 1 |
| 2021-03-12 05:27:49 | 1 |
| 2021-03-12 05:28:19 | 1 |
| 2021-03-12 05:28:50 | 1 |
| 2021-03-12 05:29:21 | 1 |
| 2021-03-12 05:29:51 | 1 |
| 2021-03-12 05:30:22 | 1 |
| 2021-03-12 05:30:53 | 1 |
| 2021-03-12 05:31:23 | 1 |
| 2021-03-12 05:31:54 | 1 |
| 2021-03-12 05:32:25 | 1 |
| 2021-03-12 05:32:55 | 1 |
| 2021-03-12 05:33:26 | 1 |
| 2021-03-12 05:33:57 | 1 |
| 2021-03-12 05:34:28 | 1 |
| 2021-03-12 05:34:58 | 1 |
| 2021-03-12 05:35:29 | 1 |
| 2021-03-12 05:36:00 | 1 |
| 2021-03-12 05:36:30 | 1 |
| 2021-03-12 05:37:01 | 1 |
| 2021-03-12 05:37:32 | 1 |
| 2021-03-12 05:38:02 | 1 |
| 2021-03-12 05:38:33 | 1 |
| 2021-03-12 05:39:04 | 1 |
| 2021-03-12 05:39:34 | 1 |
| 2021-03-12 05:40:05 | 1 |
| 2021-03-12 05:40:36 | 1 |
| 2021-03-12 05:41:06 | 1 |
| 2021-03-12 05:41:37 | 1 |
| 2021-03-12 05:42:08 | 1 |
| 2021-03-12 05:42:39 | 1 |
| 2021-03-12 05:43:09 | 1 |
| 2021-03-12 05:43:40 | 1 |
| 2021-03-12 05:44:11 | 1 |
| 2021-03-12 05:44:41 | 1 |
| 2021-03-12 05:45:12 | 1 |
| 2021-03-12 05:45:43 | 1 |
| 2021-03-12 05:46:13 | 1 |
| 2021-03-12 05:46:44 | 1 |
| 2021-03-12 05:47:15 | 1 |
| 2021-03-12 05:47:45 | 1 |
| 2021-03-12 05:48:16 | 1 |
| 2021-03-12 05:48:47 | 1 |
| 2021-03-12 05:49:18 | 1 |
| 2021-03-12 05:49:48 | 1 |
| 2021-03-12 05:50:19 | 1 |
| 2021-03-12 05:50:50 | 1 |
| 2021-03-12 05:51:20 | 1 |
| 2021-03-12 05:51:51 | 1 |
| 2021-03-12 05:52:22 | 1 |
| 2021-03-12 05:52:52 | 1 |
| 2021-03-12 05:53:23 | 1 |
| 2021-03-12 05:53:54 | 1 |
| 2021-03-12 05:54:24 | 1 |
| 2021-03-12 05:54:55 | 1 |
| 2021-03-12 05:55:26 | 1 |
| 2021-03-12 05:55:56 | 1 |
| 2021-03-12 05:56:27 | 1 |
| 2021-03-12 05:56:58 | 1 |
| 2021-03-12 05:57:29 | 1 |
| 2021-03-12 05:57:59 | 1 |
| 2021-03-12 05:58:30 | 1 |
| 2021-03-12 05:59:01 | 1 |
| 2021-03-12 05:59:31 | 1 |
| 2021-03-12 06:00:02 | 1 |
| 2021-03-12 06:00:33 | 1 |
| 2021-03-12 06:01:03 | 1 |
| 2021-03-12 06:01:34 | 1 |
| 2021-03-12 06:02:05 | 1 |
| 2021-03-12 06:02:35 | 1 |
| 2021-03-12 06:03:06 | 1 |
| 2021-03-12 06:03:37 | 1 |
| 2021-03-12 06:04:07 | 1 |
| 2021-03-12 06:04:38 | 1 |
| 2021-03-12 06:05:09 | 1 |
| 2021-03-12 06:05:40 | 1 |
| 2021-03-12 06:06:10 | 1 |
| 2021-03-12 06:06:41 | 1 |
| 2021-03-12 06:07:12 | 1 |
| 2021-03-12 06:07:42 | 1 |
| 2021-03-12 06:08:13 | 1 |
| 2021-03-12 06:08:44 | 1 |
| 2021-03-12 06:09:14 | 1 |
| 2021-03-12 06:09:45 | 1 |
| 2021-03-12 06:10:16 | 1 |
| 2021-03-12 06:10:46 | 1 |
| 2021-03-12 06:11:17 | 1 |
| 2021-03-12 06:11:48 | 1 |
| 2021-03-12 06:12:18 | 1 |
| 2021-03-12 06:12:49 | 1 |
| 2021-03-12 06:13:20 | 1 |
| 2021-03-12 06:13:51 | 1 |
| 2021-03-12 06:14:21 | 1 |
| 2021-03-12 06:14:52 | 1 |
| 2021-03-12 06:15:23 | 1 |
| 2021-03-12 06:15:53 | 1 |
| 2021-03-12 06:16:24 | 1 |
| 2021-03-12 06:16:55 | 1 |
| 2021-03-12 06:17:25 | 1 |
| 2021-03-12 06:17:56 | 1 |
| 2021-03-12 06:18:27 | 1 |
| 2021-03-12 06:18:57 | 1 |
| 2021-03-12 06:19:28 | 1 |
| 2021-03-12 06:19:59 | 1 |
| 2021-03-12 06:20:30 | 1 |
| 2021-03-12 06:21:00 | 1 |
| 2021-03-12 06:21:31 | 1 |
| 2021-03-12 06:22:02 | 1 |
| 2021-03-12 06:22:32 | 1 |
| 2021-03-12 06:23:03 | 1 |
| 2021-03-12 06:23:34 | 1 |
| 2021-03-12 06:24:04 | 1 |
| 2021-03-12 06:24:35 | 1 |
| 2021-03-12 06:25:06 | 1 |
| 2021-03-12 06:25:36 | 1 |
| 2021-03-12 06:26:07 | 1 |
| 2021-03-12 06:26:38 | 1 |
| 2021-03-12 06:27:08 | 1 |
| 2021-03-12 06:27:39 | 1 |
| 2021-03-12 06:28:10 | 1 |
| 2021-03-12 06:28:41 | 1 |
| 2021-03-12 06:29:11 | 1 |
| 2021-03-12 06:29:42 | 1 |
| 2021-03-12 06:30:13 | 1 |
| 2021-03-12 06:30:43 | 1 |
| 2021-03-12 06:31:14 | 1 |
| 2021-03-12 06:31:45 | 1 |
| 2021-03-12 06:32:15 | 1 |
| 2021-03-12 06:32:46 | 1 |
| 2021-03-12 06:33:17 | 1 |
| 2021-03-12 06:33:47 | 1 |
| 2021-03-12 06:34:18 | 1 |
| 2021-03-12 06:34:49 | 1 |
| 2021-03-12 06:35:19 | 1 |
| 2021-03-12 06:35:50 | 1 |
| 2021-03-12 06:36:21 | 1 |
| 2021-03-12 06:36:52 | 1 |
| 2021-03-12 06:37:22 | 1 |
| 2021-03-12 06:37:53 | 1 |
| 2021-03-12 06:38:24 | 1 |
| 2021-03-12 06:38:54 | 1 |
| 2021-03-12 06:39:25 | 1 |
| 2021-03-12 06:39:56 | 1 |
| 2021-03-12 06:40:26 | 1 |
| 2021-03-12 06:40:57 | 1 |
| 2021-03-12 06:41:28 | 1 |
| 2021-03-12 06:41:58 | 1 |
| 2021-03-12 06:42:29 | 1 |
| 2021-03-12 06:43:00 | 1 |
| 2021-03-12 06:43:31 | 1 |
| 2021-03-12 06:44:01 | 1 |
| 2021-03-12 06:44:32 | 1 |
| 2021-03-12 06:45:03 | 1 |
| 2021-03-12 06:45:33 | 1 |
| 2021-03-12 06:46:04 | 1 |
| 2021-03-12 06:46:35 | 1 |
| 2021-03-12 06:47:05 | 1 |
| 2021-03-12 06:47:36 | 1 |
| 2021-03-12 06:48:07 | 1 |
| 2021-03-12 06:48:37 | 1 |
| 2021-03-12 06:49:08 | 1 |
| 2021-03-12 06:49:39 | 1 |
| 2021-03-12 06:50:09 | 1 |
| 2021-03-12 06:50:40 | 1 |
| 2021-03-12 06:51:11 | 1 |
| 2021-03-12 06:51:42 | 1 |
| 2021-03-12 06:52:12 | 1 |
| 2021-03-12 06:52:43 | 1 |
| 2021-03-12 06:53:14 | 1 |
| 2021-03-12 06:53:44 | 1 |
| 2021-03-12 06:54:15 | 1 |
| 2021-03-12 06:54:46 | 1 |
| 2021-03-12 06:55:16 | 1 |
| 2021-03-12 06:55:47 | 1 |
| 2021-03-12 06:56:18 | 1 |
| 2021-03-12 06:56:48 | 1 |
| 2021-03-12 06:57:19 | 1 |
| 2021-03-12 06:57:50 | 1 |
| 2021-03-12 06:58:21 | 1 |
| 2021-03-12 06:58:51 | 1 |
| 2021-03-12 06:59:22 | 1 |
| 2021-03-12 06:59:53 | 1 |
| 2021-03-12 07:00:23 | 1 |
| 2021-03-12 07:00:54 | 1 |
| 2021-03-12 07:01:25 | 1 |
| 2021-03-12 07:01:55 | 1 |
| 2021-03-12 07:02:26 | 1 |
| 2021-03-12 07:02:57 | 1 |
| 2021-03-12 07:03:27 | 1 |
| 2021-03-12 07:03:58 | 1 |
| 2021-03-12 07:04:29 | 1 |
| 2021-03-12 07:04:59 | 1 |
| 2021-03-12 07:05:30 | 1 |
| 2021-03-12 07:06:01 | 1 |
| 2021-03-12 07:06:32 | 1 |
| 2021-03-12 07:07:02 | 1 |
| 2021-03-12 07:07:33 | 1 |
| 2021-03-12 07:08:04 | 1 |
| 2021-03-12 07:08:34 | 1 |
| 2021-03-12 07:09:05 | 1 |
| 2021-03-12 07:09:36 | 1 |
| 2021-03-12 07:10:06 | 1 |
| 2021-03-12 07:10:37 | 1 |
| 2021-03-12 07:11:08 | 1 |
| 2021-03-12 07:11:38 | 1 |
| 2021-03-12 07:12:09 | 1 |
| 2021-03-12 07:12:40 | 1 |
| 2021-03-12 07:13:10 | 1 |
| 2021-03-12 07:13:41 | 1 |
| 2021-03-12 07:14:12 | 1 |
| 2021-03-12 07:14:43 | 1 |
| 2021-03-12 07:15:13 | 1 |
| 2021-03-12 07:15:44 | 1 |
| 2021-03-12 07:16:15 | 1 |
| 2021-03-12 07:16:45 | 1 |
| 2021-03-12 07:17:16 | 1 |
| 2021-03-12 07:17:47 | 1 |
| 2021-03-12 07:18:17 | 1 |
| 2021-03-12 07:18:48 | 1 |
| 2021-03-12 07:19:19 | 1 |
| 2021-03-12 07:19:49 | 1 |
| 2021-03-12 07:20:20 | 1 |
| 2021-03-12 07:20:51 | 1 |
| 2021-03-12 07:21:22 | 1 |
| 2021-03-12 07:21:52 | 1 |
| 2021-03-12 07:22:23 | 1 |
| 2021-03-12 07:22:54 | 1 |
| 2021-03-12 07:23:24 | 1 |
| 2021-03-12 07:23:55 | 1 |
| 2021-03-12 07:24:26 | 1 |
| 2021-03-12 07:24:56 | 1 |
| 2021-03-12 07:25:27 | 1 |
| 2021-03-12 07:25:58 | 1 |
| 2021-03-12 07:26:28 | 1 |
| 2021-03-12 07:26:59 | 1 |
| 2021-03-12 07:27:30 | 1 |
| 2021-03-12 07:28:00 | 1 |
| 2021-03-12 07:28:31 | 1 |
| 2021-03-12 07:29:02 | 1 |
| 2021-03-12 07:29:33 | 1 |
| 2021-03-12 07:30:03 | 1 |
| 2021-03-12 07:30:34 | 1 |
| 2021-03-12 07:31:05 | 1 |
| 2021-03-12 07:31:35 | 1 |
| 2021-03-12 07:32:06 | 1 |
| 2021-03-12 07:32:37 | 1 |
| 2021-03-12 07:33:07 | 1 |
| 2021-03-12 07:33:38 | 1 |
| 2021-03-12 07:34:09 | 1 |
| 2021-03-12 07:34:39 | 1 |
| 2021-03-12 07:35:10 | 1 |
| 2021-03-12 07:35:41 | 1 |
| 2021-03-12 07:36:11 | 1 |
| 2021-03-12 07:36:42 | 1 |
| 2021-03-12 07:37:13 | 1 |
| 2021-03-12 07:37:44 | 1 |
| 2021-03-12 07:38:14 | 1 |
| 2021-03-12 07:38:45 | 1 |
| 2021-03-12 07:39:16 | 1 |
| 2021-03-12 07:39:46 | 1 |
| 2021-03-12 07:40:17 | 1 |
| 2021-03-12 07:40:48 | 1 |
| 2021-03-12 07:41:18 | 1 |
| 2021-03-12 07:41:49 | 1 |
| 2021-03-12 07:42:20 | 1 |
| 2021-03-12 07:42:50 | 1 |
| 2021-03-12 07:43:21 | 1 |
| 2021-03-12 07:43:52 | 1 |
| 2021-03-12 07:44:22 | 1 |
| 2021-03-12 07:44:53 | 1 |
| 2021-03-12 07:45:24 | 1 |
| 2021-03-12 07:45:55 | 1 |
| 2021-03-12 07:46:25 | 1 |
| 2021-03-12 07:46:56 | 1 |
| 2021-03-12 07:47:27 | 1 |
| 2021-03-12 07:47:57 | 1 |
| 2021-03-12 07:48:28 | 1 |
| 2021-03-12 07:48:59 | 1 |
| 2021-03-12 07:49:29 | 1 |
| 2021-03-12 07:50:00 | 1 |
| 2021-03-12 07:50:31 | 1 |
| 2021-03-12 07:51:01 | 1 |
| 2021-03-12 07:51:32 | 1 |
| 2021-03-12 07:52:03 | 1 |
| 2021-03-12 07:52:33 | 1 |
| 2021-03-12 07:53:04 | 1 |
| 2021-03-12 07:53:35 | 1 |
| 2021-03-12 07:54:06 | 1 |
| 2021-03-12 07:54:36 | 1 |
| 2021-03-12 07:55:07 | 1 |
| 2021-03-12 07:55:38 | 1 |
| 2021-03-12 07:56:08 | 1 |
| 2021-03-12 07:56:39 | 1 |